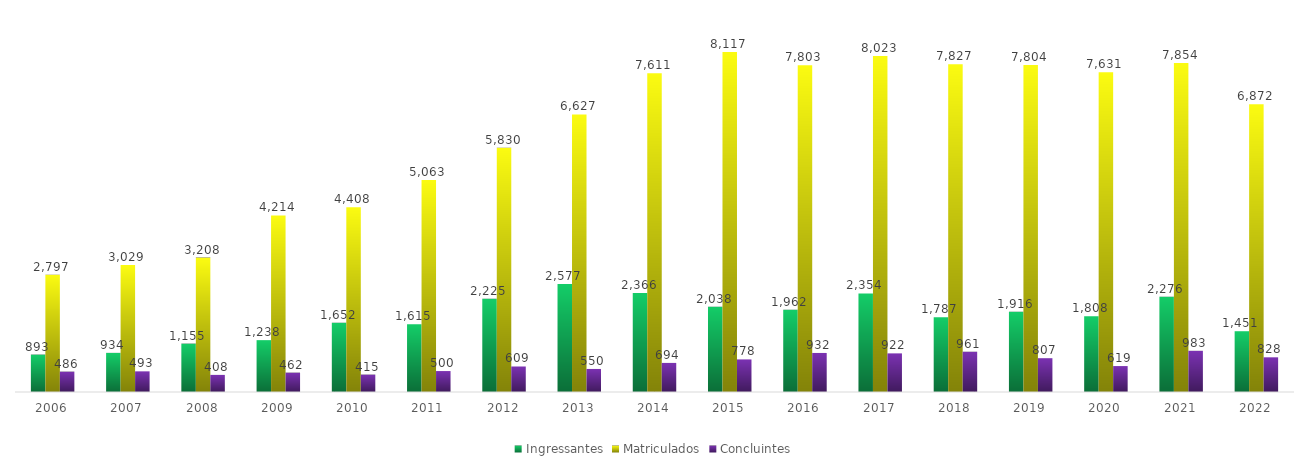
| Category | Ingressantes | Matriculados | Concluintes |
|---|---|---|---|
| 2006.0 | 893 | 2797 | 486 |
| 2007.0 | 934 | 3029 | 493 |
| 2008.0 | 1155 | 3208 | 408 |
| 2009.0 | 1238 | 4214 | 462 |
| 2010.0 | 1652 | 4408 | 415 |
| 2011.0 | 1615 | 5063 | 500 |
| 2012.0 | 2225 | 5830 | 609 |
| 2013.0 | 2577 | 6627 | 550 |
| 2014.0 | 2366 | 7611 | 694 |
| 2015.0 | 2038 | 8117 | 778 |
| 2016.0 | 1962 | 7803 | 932 |
| 2017.0 | 2354 | 8023 | 922 |
| 2018.0 | 1787 | 7827 | 961 |
| 2019.0 | 1916 | 7804 | 807 |
| 2020.0 | 1808 | 7631 | 619 |
| 2021.0 | 2276 | 7854 | 983 |
| 2022.0 | 1451 | 6872 | 828 |